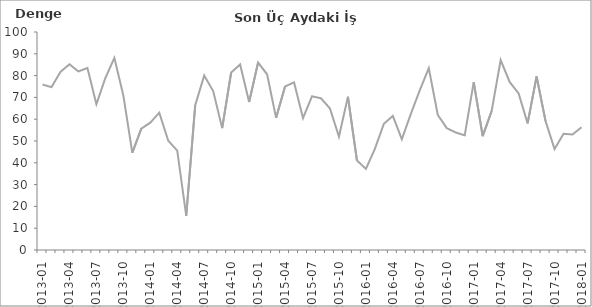
| Category | Denge  |
|---|---|
| 2013-01 | 75.9 |
|  | 74.7 |
|  | 81.7 |
| 2013-04 | 85.2 |
|  | 81.9 |
|  | 83.5 |
| 2013-07 | 66.9 |
|  | 78.9 |
|  | 88.1 |
| 2013-10 | 70.9 |
|  | 44.6 |
|  | 55.7 |
| 2014-01 | 58.4 |
|  | 63 |
|  | 50.1 |
| 2014-04 | 45.6 |
|  | 15.7 |
|  | 66.4 |
| 2014-07 | 80 |
|  | 72.9 |
|  | 55.9 |
| 2014-10 | 81.4 |
|  | 85.1 |
|  | 67.9 |
| 2015-01 | 86 |
|  | 80.6 |
|  | 60.6 |
| 2015-04 | 75 |
|  | 76.9 |
|  | 60.5 |
| 2015-07 | 70.5 |
|  | 69.6 |
|  | 64.9 |
| 2015-10 | 52 |
|  | 70.3 |
|  | 41.1 |
| 2016-01 | 37.2 |
|  | 46.4 |
|  | 57.9 |
| 2016-04 | 61.5 |
|  | 50.8 |
|  | 62.4 |
| 2016-07 | 73.3 |
|  | 83.4 |
|  | 62 |
| 2016-10 | 55.9 |
|  | 53.9 |
|  | 52.6 |
| 2017-01 | 77 |
|  | 52.2 |
|  | 63.8 |
| 2017-04 | 87.1 |
|  | 77.1 |
|  | 71.8 |
| 2017-07 | 58.1 |
|  | 79.6 |
|  | 59.1 |
| 2017-10 | 46.3 |
|  | 53.3 |
|  | 53 |
| 2018-01 | 56.3 |